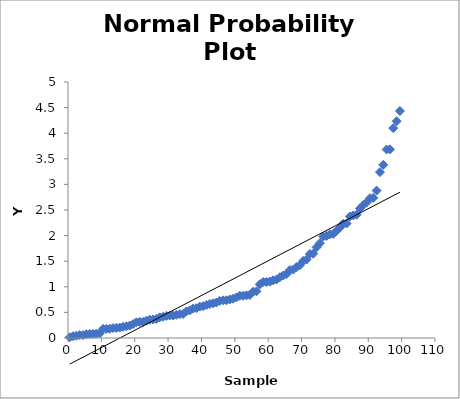
| Category | Series 0 |
|---|---|
| 0.5 | 0.013 |
| 1.5 | 0.035 |
| 2.5 | 0.045 |
| 3.5 | 0.057 |
| 4.5 | 0.058 |
| 5.5 | 0.073 |
| 6.5 | 0.079 |
| 7.5 | 0.08 |
| 8.5 | 0.085 |
| 9.5 | 0.09 |
| 10.5 | 0.178 |
| 11.5 | 0.179 |
| 12.5 | 0.181 |
| 13.5 | 0.194 |
| 14.5 | 0.198 |
| 15.5 | 0.204 |
| 16.5 | 0.218 |
| 17.5 | 0.228 |
| 18.5 | 0.243 |
| 19.5 | 0.271 |
| 20.5 | 0.307 |
| 21.5 | 0.313 |
| 22.5 | 0.314 |
| 23.5 | 0.34 |
| 24.5 | 0.357 |
| 25.5 | 0.362 |
| 26.5 | 0.372 |
| 27.5 | 0.404 |
| 28.5 | 0.415 |
| 29.5 | 0.432 |
| 30.5 | 0.438 |
| 31.5 | 0.439 |
| 32.5 | 0.453 |
| 33.5 | 0.465 |
| 34.5 | 0.469 |
| 35.5 | 0.519 |
| 36.5 | 0.538 |
| 37.5 | 0.575 |
| 38.5 | 0.582 |
| 39.5 | 0.613 |
| 40.5 | 0.622 |
| 41.5 | 0.646 |
| 42.5 | 0.665 |
| 43.5 | 0.678 |
| 44.5 | 0.693 |
| 45.5 | 0.725 |
| 46.5 | 0.735 |
| 47.5 | 0.737 |
| 48.5 | 0.753 |
| 49.5 | 0.767 |
| 50.5 | 0.794 |
| 51.5 | 0.824 |
| 52.5 | 0.826 |
| 53.5 | 0.834 |
| 54.5 | 0.841 |
| 55.5 | 0.905 |
| 56.5 | 0.912 |
| 57.5 | 1.049 |
| 58.5 | 1.093 |
| 59.5 | 1.094 |
| 60.5 | 1.101 |
| 61.5 | 1.126 |
| 62.5 | 1.143 |
| 63.5 | 1.188 |
| 64.5 | 1.22 |
| 65.5 | 1.248 |
| 66.5 | 1.326 |
| 67.5 | 1.336 |
| 68.5 | 1.386 |
| 69.5 | 1.423 |
| 70.5 | 1.506 |
| 71.5 | 1.532 |
| 72.5 | 1.641 |
| 73.5 | 1.647 |
| 74.5 | 1.77 |
| 75.5 | 1.852 |
| 76.5 | 1.982 |
| 77.5 | 1.994 |
| 78.5 | 2.025 |
| 79.5 | 2.031 |
| 80.5 | 2.095 |
| 81.5 | 2.155 |
| 82.5 | 2.235 |
| 83.5 | 2.237 |
| 84.5 | 2.373 |
| 85.5 | 2.393 |
| 86.5 | 2.408 |
| 87.5 | 2.53 |
| 88.5 | 2.597 |
| 89.5 | 2.648 |
| 90.5 | 2.73 |
| 91.5 | 2.736 |
| 92.5 | 2.879 |
| 93.5 | 3.24 |
| 94.5 | 3.382 |
| 95.5 | 3.682 |
| 96.5 | 3.685 |
| 97.5 | 4.098 |
| 98.5 | 4.234 |
| 99.5 | 4.434 |